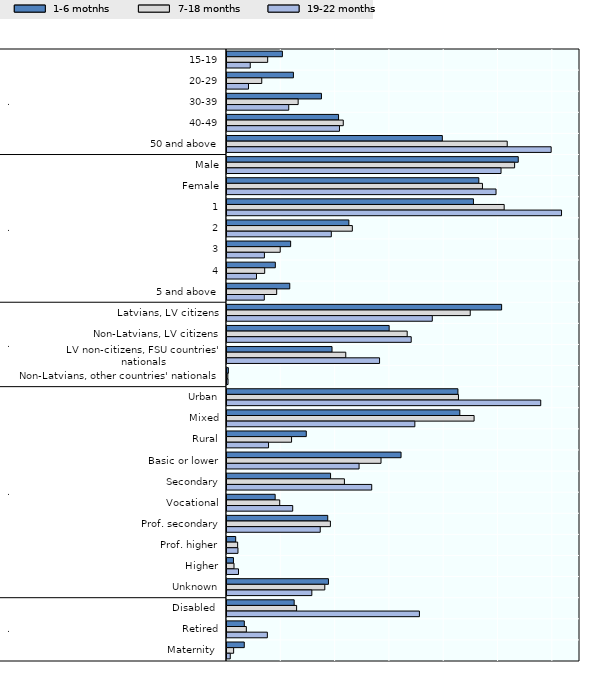
| Category | 1-6 motnhs | 7-18 months | 19-22 months |
|---|---|---|---|
| 0 | 10.2 | 7.49 | 4.28 |
| 1 | 12.23 | 6.4 | 3.96 |
| 2 | 17.39 | 13.1 | 11.37 |
| 3 | 20.54 | 21.41 | 20.71 |
| 4 | 39.65 | 51.6 | 59.69 |
| 5 | 53.63 | 52.96 | 50.46 |
| 6 | 46.37 | 47.04 | 49.54 |
| 7 | 45.38 | 51.04 | 61.6 |
| 8 | 22.44 | 23.08 | 19.21 |
| 9 | 11.72 | 9.8 | 6.89 |
| 10 | 8.9 | 6.94 | 5.43 |
| 11 | 11.56 | 9.15 | 6.87 |
| 12 | 50.57 | 44.79 | 37.8 |
| 13 | 29.86 | 33.18 | 33.92 |
| 14 | 19.34 | 21.87 | 28.09 |
| 15 | 0.25 | 0.15 | 0.19 |
| 16 | 42.52 | 42.62 | 57.77 |
| 17 | 42.87 | 45.5 | 34.59 |
| 18 | 14.6 | 11.89 | 7.65 |
| 19 | 32.05 | 28.36 | 24.32 |
| 20 | 19.07 | 21.62 | 26.65 |
| 21 | 8.87 | 9.71 | 12.1 |
| 22 | 18.55 | 19.04 | 17.17 |
| 23 | 1.6 | 1.96 | 2.02 |
| 24 | 1.19 | 1.29 | 2.12 |
| 25 | 18.68 | 18.01 | 15.62 |
| 26 | 12.37 | 12.82 | 35.43 |
| 27 | 3.19 | 3.56 | 7.43 |
| 28 | 3.18 | 1.22 | 0.6 |